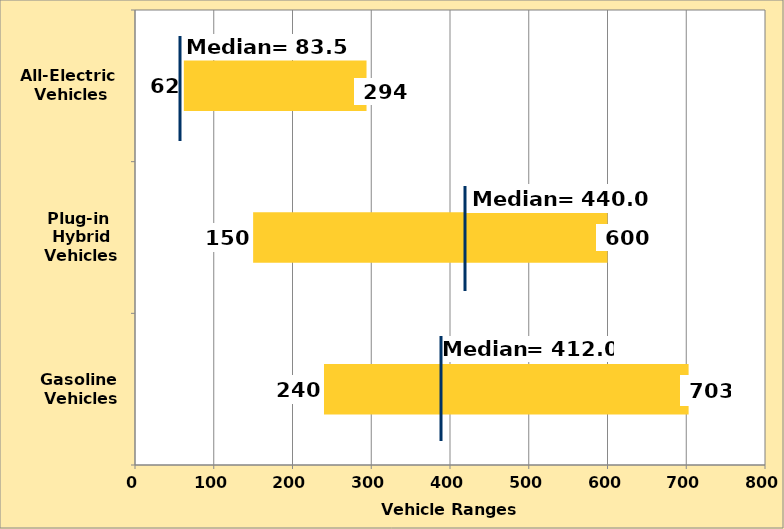
| Category | Series 0 | Series 1 |
|---|---|---|
| Gasoline
 Vehicles | 240 | 463 |
| Plug-in 
Hybrid
Vehicles | 150 | 450 |
| All-Electric
 Vehicles | 62 | 232 |